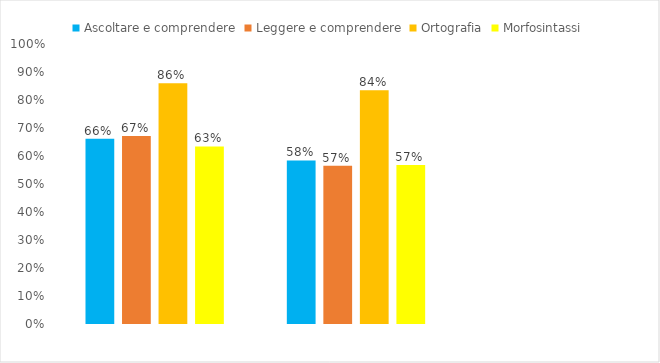
| Category | Ascoltare e comprendere | Leggere e comprendere | Ortografia | Morfosintassi |
|---|---|---|---|---|
| 3A Vivaldi | 0.662 | 0.672 | 0.86 | 0.634 |
| 3B Vivaldi | 0.584 | 0.565 | 0.835 | 0.568 |